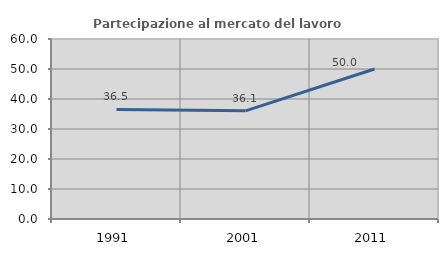
| Category | Partecipazione al mercato del lavoro  femminile |
|---|---|
| 1991.0 | 36.508 |
| 2001.0 | 36.066 |
| 2011.0 | 50 |